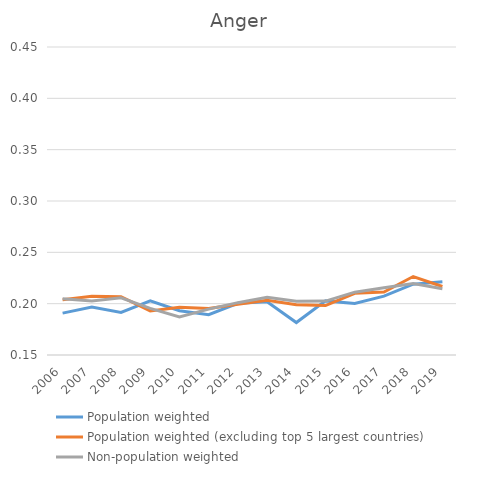
| Category | Population weighted | Population weighted (excluding top 5 largest countries) | Non-population weighted |
|---|---|---|---|
| 2006.0 | 0.191 | 0.204 | 0.205 |
| 2007.0 | 0.197 | 0.207 | 0.203 |
| 2008.0 | 0.191 | 0.207 | 0.206 |
| 2009.0 | 0.203 | 0.193 | 0.195 |
| 2010.0 | 0.193 | 0.197 | 0.187 |
| 2011.0 | 0.189 | 0.195 | 0.195 |
| 2012.0 | 0.2 | 0.199 | 0.201 |
| 2013.0 | 0.202 | 0.203 | 0.206 |
| 2014.0 | 0.182 | 0.199 | 0.202 |
| 2015.0 | 0.203 | 0.198 | 0.202 |
| 2016.0 | 0.2 | 0.21 | 0.211 |
| 2017.0 | 0.207 | 0.211 | 0.215 |
| 2018.0 | 0.219 | 0.226 | 0.22 |
| 2019.0 | 0.221 | 0.217 | 0.215 |